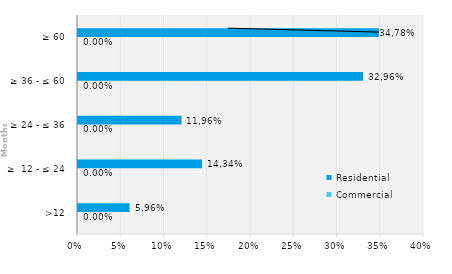
| Category | Commercial | Residential |
|---|---|---|
| >12 | 0 | 0.06 |
| ≥  12 - ≤ 24 | 0 | 0.143 |
| ≥ 24 - ≤ 36 | 0 | 0.12 |
| ≥ 36 - ≤ 60 | 0 | 0.33 |
| ≥ 60 | 0 | 0.348 |